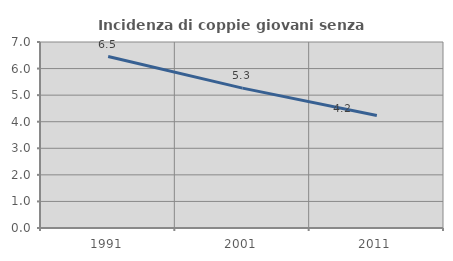
| Category | Incidenza di coppie giovani senza figli |
|---|---|
| 1991.0 | 6.452 |
| 2001.0 | 5.263 |
| 2011.0 | 4.237 |